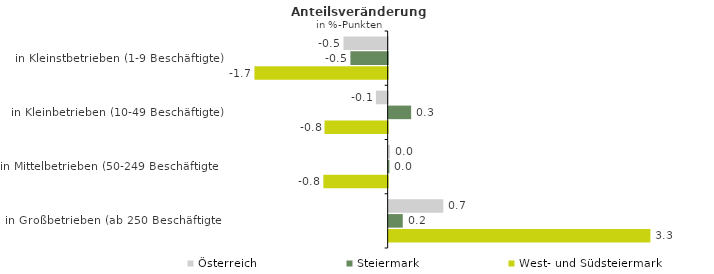
| Category | Österreich | Steiermark | West- und Südsteiermark |
|---|---|---|---|
| in Kleinstbetrieben (1-9 Beschäftigte) | -0.55 | -0.464 | -1.658 |
| in Kleinbetrieben (10-49 Beschäftigte) | -0.146 | 0.28 | -0.786 |
| in Mittelbetrieben (50-249 Beschäftigte) | 0.016 | 0.009 | -0.801 |
| in Großbetrieben (ab 250 Beschäftigte) | 0.68 | 0.175 | 3.258 |